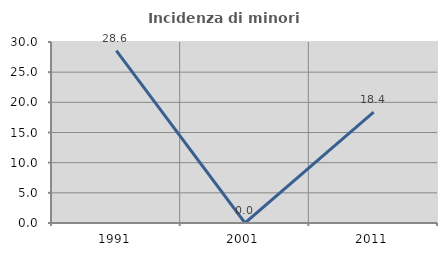
| Category | Incidenza di minori stranieri |
|---|---|
| 1991.0 | 28.571 |
| 2001.0 | 0 |
| 2011.0 | 18.367 |